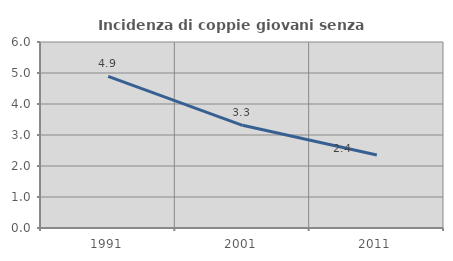
| Category | Incidenza di coppie giovani senza figli |
|---|---|
| 1991.0 | 4.891 |
| 2001.0 | 3.313 |
| 2011.0 | 2.353 |